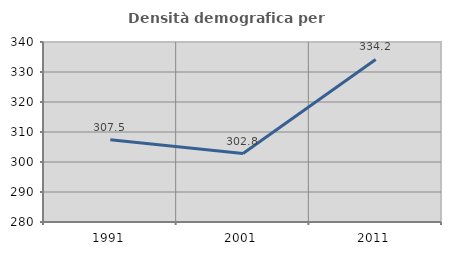
| Category | Densità demografica |
|---|---|
| 1991.0 | 307.45 |
| 2001.0 | 302.805 |
| 2011.0 | 334.193 |